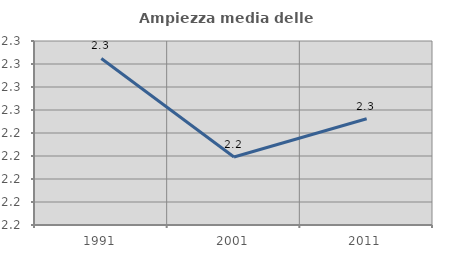
| Category | Ampiezza media delle famiglie |
|---|---|
| 1991.0 | 2.305 |
| 2001.0 | 2.219 |
| 2011.0 | 2.252 |